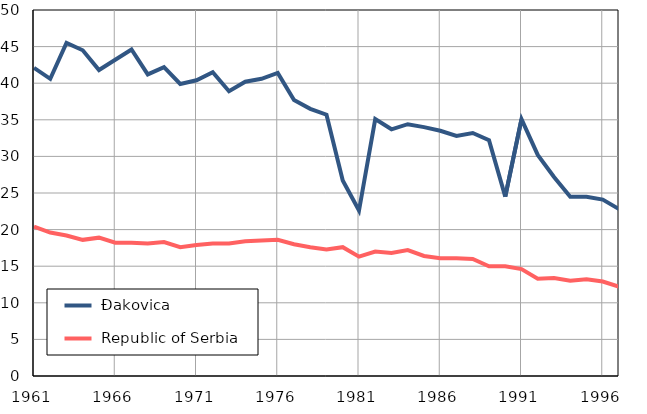
| Category |  Đakovica |  Republic of Serbia |
|---|---|---|
| 1961.0 | 42.1 | 20.4 |
| 1962.0 | 40.6 | 19.6 |
| 1963.0 | 45.5 | 19.2 |
| 1964.0 | 44.5 | 18.6 |
| 1965.0 | 41.8 | 18.9 |
| 1966.0 | 43.2 | 18.2 |
| 1967.0 | 44.6 | 18.2 |
| 1968.0 | 41.2 | 18.1 |
| 1969.0 | 42.2 | 18.3 |
| 1970.0 | 39.9 | 17.6 |
| 1971.0 | 40.4 | 17.9 |
| 1972.0 | 41.5 | 18.1 |
| 1973.0 | 38.9 | 18.1 |
| 1974.0 | 40.2 | 18.4 |
| 1975.0 | 40.6 | 18.5 |
| 1976.0 | 41.4 | 18.6 |
| 1977.0 | 37.7 | 18 |
| 1978.0 | 36.5 | 17.6 |
| 1979.0 | 35.7 | 17.3 |
| 1980.0 | 26.7 | 17.6 |
| 1981.0 | 22.6 | 16.3 |
| 1982.0 | 35.1 | 17 |
| 1983.0 | 33.7 | 16.8 |
| 1984.0 | 34.4 | 17.2 |
| 1985.0 | 34 | 16.4 |
| 1986.0 | 33.5 | 16.1 |
| 1987.0 | 32.8 | 16.1 |
| 1988.0 | 33.2 | 16 |
| 1989.0 | 32.2 | 15 |
| 1990.0 | 24.5 | 15 |
| 1991.0 | 35.1 | 14.6 |
| 1992.0 | 30.2 | 13.3 |
| 1993.0 | 27.2 | 13.4 |
| 1994.0 | 24.5 | 13 |
| 1995.0 | 24.5 | 13.2 |
| 1996.0 | 24.1 | 12.9 |
| 1997.0 | 22.8 | 12.2 |